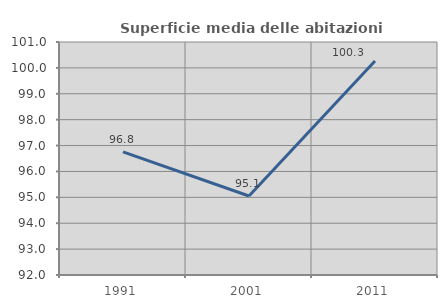
| Category | Superficie media delle abitazioni occupate |
|---|---|
| 1991.0 | 96.755 |
| 2001.0 | 95.053 |
| 2011.0 | 100.269 |